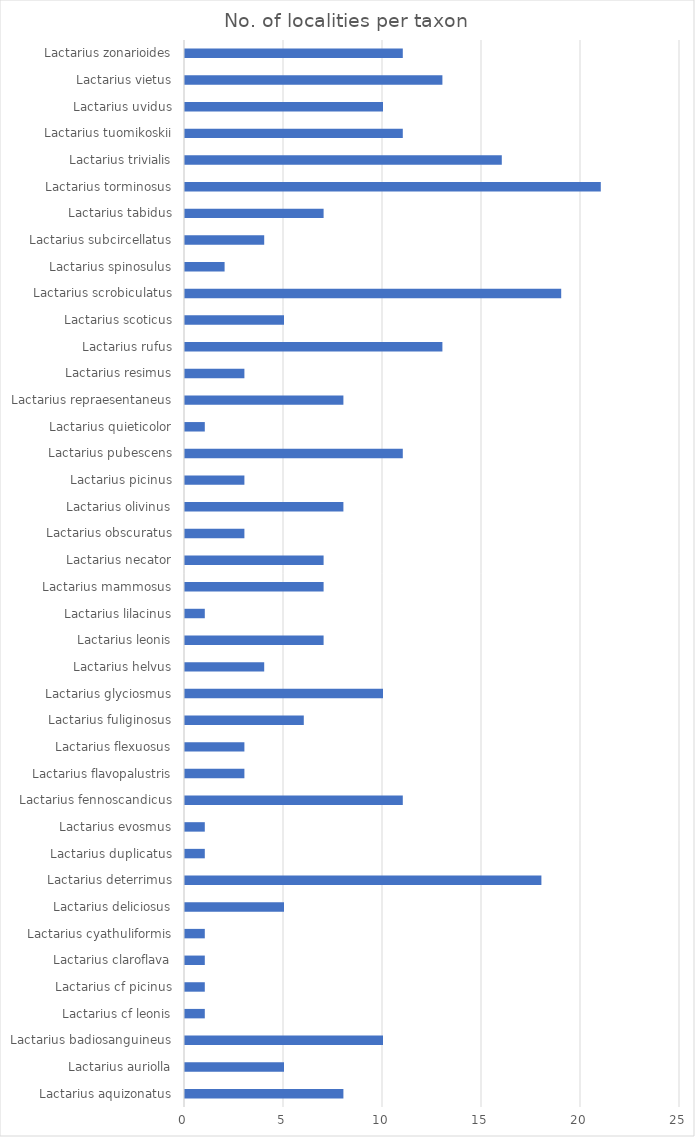
| Category | Series 0 |
|---|---|
| Lactarius aquizonatus | 8 |
| Lactarius auriolla | 5 |
| Lactarius badiosanguineus | 10 |
| Lactarius cf leonis | 1 |
| Lactarius cf picinus | 1 |
| Lactarius claroflava | 1 |
| Lactarius cyathuliformis | 1 |
| Lactarius deliciosus | 5 |
| Lactarius deterrimus | 18 |
| Lactarius duplicatus | 1 |
| Lactarius evosmus | 1 |
| Lactarius fennoscandicus | 11 |
| Lactarius flavopalustris | 3 |
| Lactarius flexuosus | 3 |
| Lactarius fuliginosus | 6 |
| Lactarius glyciosmus | 10 |
| Lactarius helvus | 4 |
| Lactarius leonis | 7 |
| Lactarius lilacinus | 1 |
| Lactarius mammosus | 7 |
| Lactarius necator | 7 |
| Lactarius obscuratus | 3 |
| Lactarius olivinus | 8 |
| Lactarius picinus | 3 |
| Lactarius pubescens | 11 |
| Lactarius quieticolor | 1 |
| Lactarius repraesentaneus | 8 |
| Lactarius resimus | 3 |
| Lactarius rufus | 13 |
| Lactarius scoticus | 5 |
| Lactarius scrobiculatus | 19 |
| Lactarius spinosulus | 2 |
| Lactarius subcircellatus | 4 |
| Lactarius tabidus | 7 |
| Lactarius torminosus | 21 |
| Lactarius trivialis | 16 |
| Lactarius tuomikoskii | 11 |
| Lactarius uvidus | 10 |
| Lactarius vietus | 13 |
| Lactarius zonarioides | 11 |